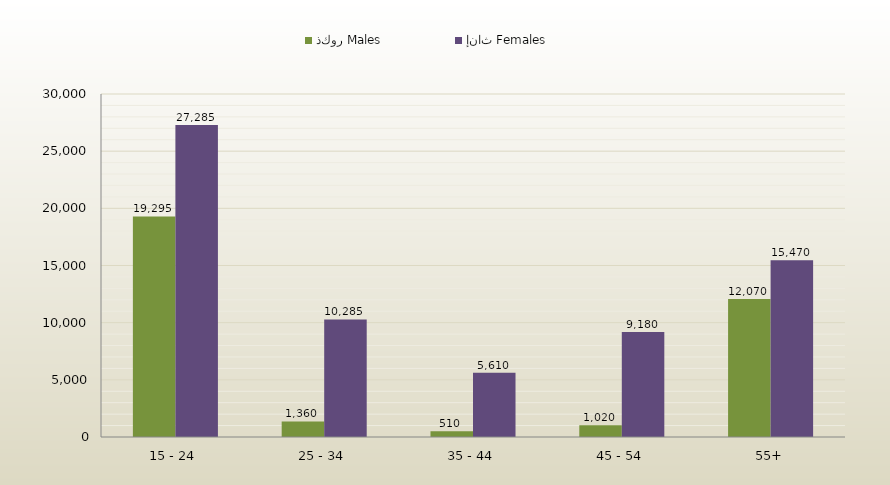
| Category | ذكور Males | إناث Females |
|---|---|---|
| 15 - 24 | 19295 | 27285 |
| 25 - 34 | 1360 | 10285 |
| 35 - 44 | 510 | 5610 |
| 45 - 54 | 1020 | 9180 |
| 55+ | 12070 | 15470 |